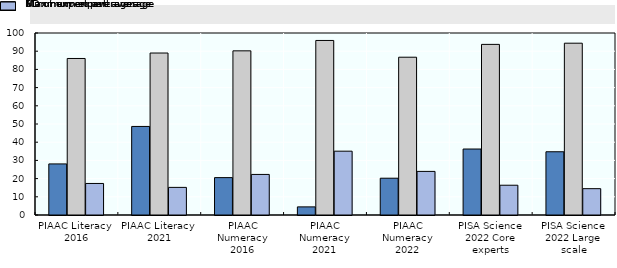
| Category | Miminum expert average | Maximum expert average | SD of expert averages |
|---|---|---|---|
| PIAAC Literacy 
2016 | 28.07 | 86 | 17.33 |
| PIAAC Literacy 
2021 | 48.66 | 89 | 15.17 |
| PIAAC Numeracy 2016 | 20.54 | 90.2 | 22.29 |
| PIAAC Numeracy 2021 | 4.46 | 95.9 | 35.07 |
| PIAAC Numeracy 2022 | 20.21 | 86.7 | 23.96 |
| PISA Science 2022 Core experts | 36.25 | 93.75 | 16.36 |
| PISA Science 2022 Large scale | 34.75 | 94.4 | 14.47 |